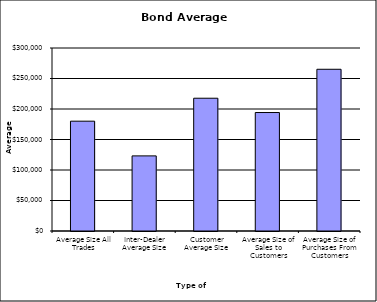
| Category | Security Type |
|---|---|
| Average Size All Trades | 180024.016 |
| Inter-Dealer Average Size | 123153.234 |
| Customer Average Size | 217661.135 |
| Average Size of Sales to Customers | 194224.544 |
| Average Size of Purchases From Customers | 265114.442 |